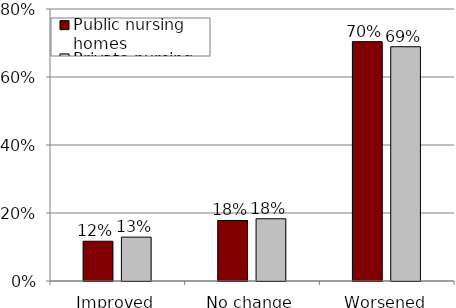
| Category | Public nursing homes | Private nursing homes |
|---|---|---|
| Improved | 0.117 | 0.129 |
| No change | 0.178 | 0.183 |
| Worsened | 0.704 | 0.689 |